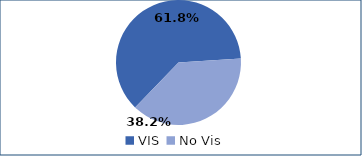
| Category | Series 0 |
|---|---|
| VIS | 0.618 |
| No Vis | 0.382 |